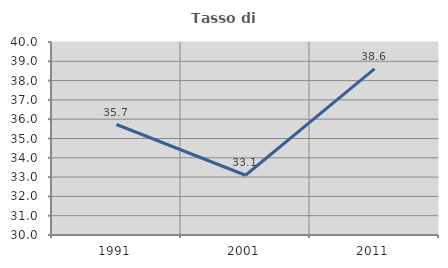
| Category | Tasso di occupazione   |
|---|---|
| 1991.0 | 35.725 |
| 2001.0 | 33.097 |
| 2011.0 | 38.603 |